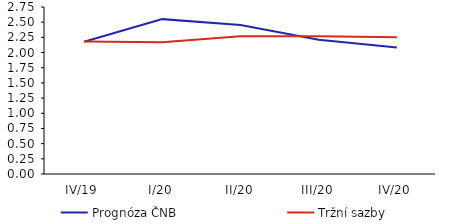
| Category | Prognóza ČNB | Tržní sazby |
|---|---|---|
| IV/19 | 2.178 | 2.18 |
| I/20 | 2.55 | 2.17 |
| II/20 | 2.455 | 2.27 |
| III/20 | 2.211 | 2.27 |
| IV/20 | 2.082 | 2.25 |